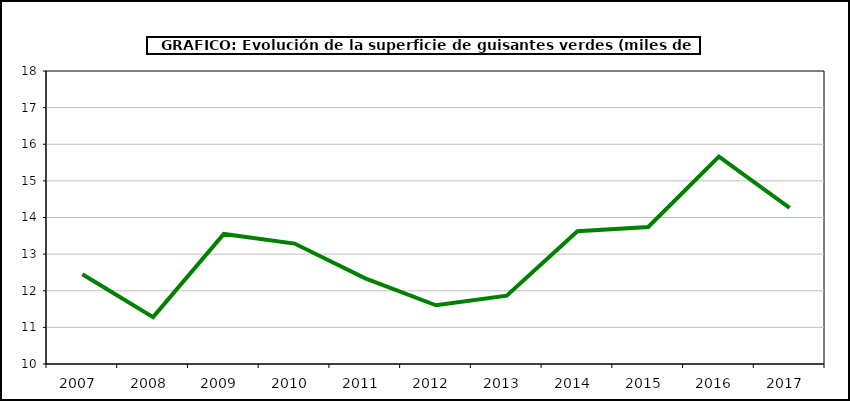
| Category | superficie |
|---|---|
| 2007.0 | 12.451 |
| 2008.0 | 11.28 |
| 2009.0 | 13.552 |
| 2010.0 | 13.288 |
| 2011.0 | 12.338 |
| 2012.0 | 11.604 |
| 2013.0 | 11.867 |
| 2014.0 | 13.624 |
| 2015.0 | 13.74 |
| 2016.0 | 15.663 |
| 2017.0 | 14.263 |